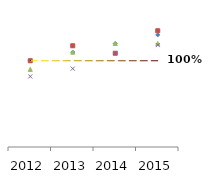
| Category | ACC Ltd Freight & Forwarding | Ambuja Cement Fixed Cost | JK Lakshmi Cement Fixed Cost | Ultratech Cement Fixed Cost | Baseline |
|---|---|---|---|---|---|
| 2012.0 | 1 | 1 | 0.95 | 0.909 | 1 |
| 2013.0 | 1.05 | 1.087 | 1.05 | 0.955 | 1 |
| 2014.0 | 1.1 | 1.043 | 1.1 | 1.045 | 1 |
| 2015.0 | 1.15 | 1.174 | 1.1 | 1.091 | 1 |